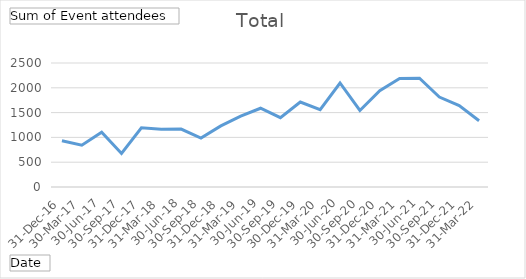
| Category | Total |
|---|---|
| 31-Dec-16 | 931 |
| 30-Mar-17 | 844 |
| 30-Jun-17 | 1104 |
| 30-Sep-17 | 676 |
| 31-Dec-17 | 1195 |
| 31-Mar-18 | 1165 |
| 30-Jun-18 | 1169 |
| 30-Sep-18 | 986 |
| 31-Dec-18 | 1232 |
| 31-Mar-19 | 1427 |
| 30-Jun-19 | 1588 |
| 30-Sep-19 | 1398 |
| 30-Dec-19 | 1713 |
| 31-Mar-20 | 1559 |
| 30-Jun-20 | 2097 |
| 30-Sep-20 | 1543 |
| 31-Dec-20 | 1943 |
| 31-Mar-21 | 2186 |
| 30-Jun-21 | 2194 |
| 30-Sep-21 | 1813 |
| 31-Dec-21 | 1643 |
| 31-Mar-22 | 1335 |